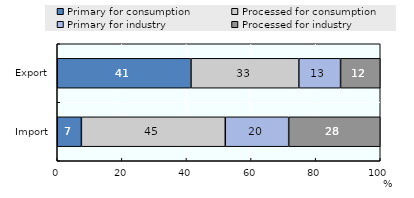
| Category | Primary for consumption | Processed for consumption | Primary for industry | Processed for industry |
|---|---|---|---|---|
| Import | 7.473 | 44.551 | 19.634 | 28.343 |
| Export | 41.411 | 33.383 | 12.921 | 12.285 |